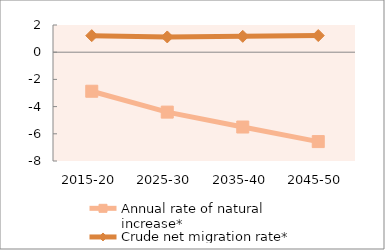
| Category | Annual rate of natural increase* | Crude net migration rate* |
|---|---|---|
| 2015-20 | -2.871 | 1.216 |
| 2025-30 | -4.406 | 1.122 |
| 2035-40 | -5.502 | 1.166 |
| 2045-50 | -6.573 | 1.224 |